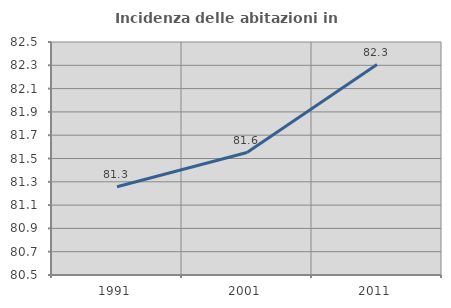
| Category | Incidenza delle abitazioni in proprietà  |
|---|---|
| 1991.0 | 81.258 |
| 2001.0 | 81.551 |
| 2011.0 | 82.307 |